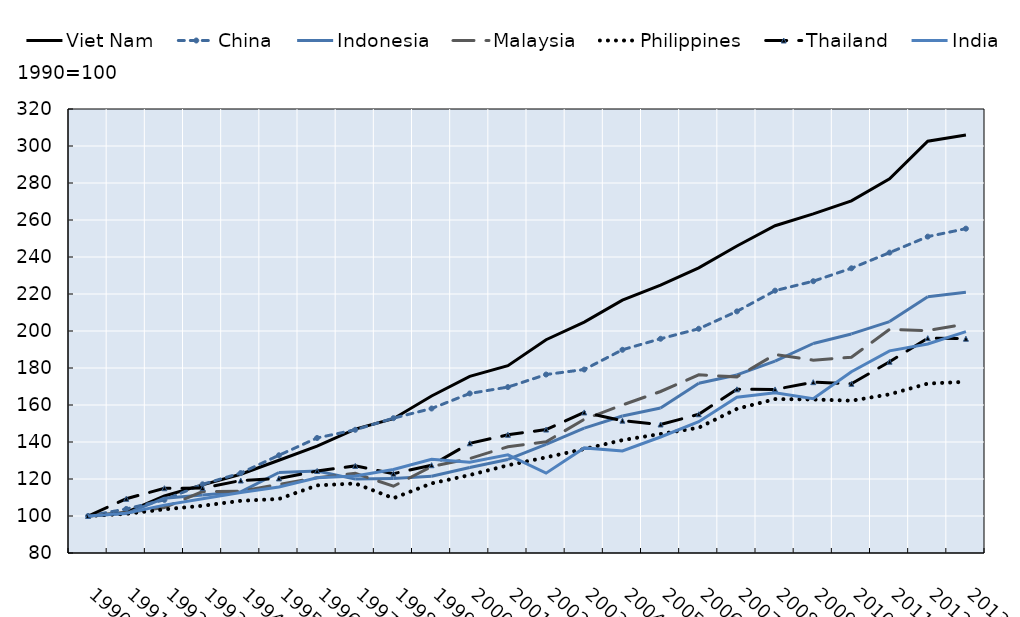
| Category | Viet Nam | China | Indonesia | Malaysia | Philippines | Thailand | India |
|---|---|---|---|---|---|---|---|
| 1990.0 | 100 | 100 | 100 | 100 | 100 | 100 | 100 |
| 1991.0 | 101.937 | 103.815 | 101.323 | 101.763 | 101.169 | 109.318 | 101.515 |
| 1992.0 | 110.831 | 108.725 | 109.619 | 104.6 | 103.595 | 115.002 | 105.875 |
| 1993.0 | 116.798 | 117.117 | 111.33 | 113.211 | 105.544 | 115.078 | 109.362 |
| 1994.0 | 122.585 | 123.2 | 113.041 | 113.346 | 108.214 | 119.167 | 112.664 |
| 1995.0 | 130.128 | 132.825 | 123.531 | 117.089 | 109.21 | 120.307 | 115.68 |
| 1996.0 | 137.784 | 142.175 | 124.29 | 120.665 | 116.544 | 124.32 | 120.626 |
| 1997.0 | 146.994 | 146.596 | 119.948 | 123.065 | 117.583 | 127.086 | 121.569 |
| 1998.0 | 152.601 | 152.876 | 120.223 | 116.082 | 109.615 | 122.861 | 125.129 |
| 1999.0 | 164.873 | 158.099 | 121.53 | 126.742 | 117.627 | 127.451 | 130.646 |
| 2000.0 | 175.456 | 166.236 | 126.259 | 131.073 | 122.145 | 139.292 | 129.088 |
| 2001.0 | 181.243 | 169.679 | 130.552 | 137.452 | 127.414 | 143.897 | 133.076 |
| 2002.0 | 195.271 | 176.467 | 138.67 | 140.138 | 131.702 | 146.724 | 123.17 |
| 2003.0 | 204.819 | 179.186 | 147.515 | 152.275 | 136.192 | 155.996 | 136.807 |
| 2004.0 | 216.64 | 189.847 | 154.051 | 159.997 | 141.013 | 151.543 | 135.163 |
| 2005.0 | 224.747 | 195.814 | 158.393 | 167.299 | 144.334 | 149.46 | 142.696 |
| 2006.0 | 234.136 | 201.213 | 171.74 | 176.314 | 147.741 | 154.993 | 150.943 |
| 2007.0 | 245.936 | 210.603 | 176.243 | 175.206 | 157.904 | 168.475 | 164.222 |
| 2008.0 | 256.902 | 221.811 | 183.699 | 187.326 | 163.216 | 168.415 | 166.567 |
| 2009.0 | 263.319 | 226.917 | 193.238 | 184.22 | 162.985 | 172.351 | 163.393 |
| 2010.0 | 270.367 | 233.901 | 198.418 | 185.849 | 162.336 | 171.455 | 177.973 |
| 2011.0 | 282.279 | 242.371 | 205.084 | 200.89 | 165.772 | 183.417 | 189.251 |
| 2012.0 | 302.567 | 251.017 | 218.528 | 200.201 | 171.589 | 196.139 | 192.953 |
| 2013.0 | 305.922 | 255.321 | 220.949 | 203.777 | 172.528 | 195.835 | 199.628 |